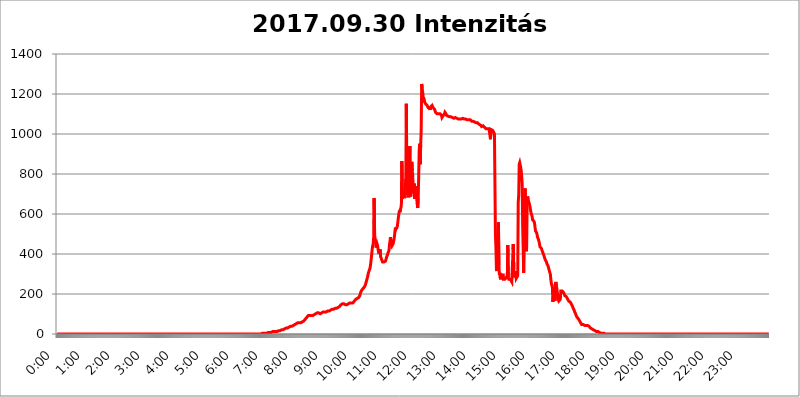
| Category | 2017.09.30 Intenzitás [W/m^2] |
|---|---|
| 0.0 | 0 |
| 0.0006944444444444445 | 0 |
| 0.001388888888888889 | 0 |
| 0.0020833333333333333 | 0 |
| 0.002777777777777778 | 0 |
| 0.003472222222222222 | 0 |
| 0.004166666666666667 | 0 |
| 0.004861111111111111 | 0 |
| 0.005555555555555556 | 0 |
| 0.0062499999999999995 | 0 |
| 0.006944444444444444 | 0 |
| 0.007638888888888889 | 0 |
| 0.008333333333333333 | 0 |
| 0.009027777777777779 | 0 |
| 0.009722222222222222 | 0 |
| 0.010416666666666666 | 0 |
| 0.011111111111111112 | 0 |
| 0.011805555555555555 | 0 |
| 0.012499999999999999 | 0 |
| 0.013194444444444444 | 0 |
| 0.013888888888888888 | 0 |
| 0.014583333333333332 | 0 |
| 0.015277777777777777 | 0 |
| 0.015972222222222224 | 0 |
| 0.016666666666666666 | 0 |
| 0.017361111111111112 | 0 |
| 0.018055555555555557 | 0 |
| 0.01875 | 0 |
| 0.019444444444444445 | 0 |
| 0.02013888888888889 | 0 |
| 0.020833333333333332 | 0 |
| 0.02152777777777778 | 0 |
| 0.022222222222222223 | 0 |
| 0.02291666666666667 | 0 |
| 0.02361111111111111 | 0 |
| 0.024305555555555556 | 0 |
| 0.024999999999999998 | 0 |
| 0.025694444444444447 | 0 |
| 0.02638888888888889 | 0 |
| 0.027083333333333334 | 0 |
| 0.027777777777777776 | 0 |
| 0.02847222222222222 | 0 |
| 0.029166666666666664 | 0 |
| 0.029861111111111113 | 0 |
| 0.030555555555555555 | 0 |
| 0.03125 | 0 |
| 0.03194444444444445 | 0 |
| 0.03263888888888889 | 0 |
| 0.03333333333333333 | 0 |
| 0.034027777777777775 | 0 |
| 0.034722222222222224 | 0 |
| 0.035416666666666666 | 0 |
| 0.036111111111111115 | 0 |
| 0.03680555555555556 | 0 |
| 0.0375 | 0 |
| 0.03819444444444444 | 0 |
| 0.03888888888888889 | 0 |
| 0.03958333333333333 | 0 |
| 0.04027777777777778 | 0 |
| 0.04097222222222222 | 0 |
| 0.041666666666666664 | 0 |
| 0.042361111111111106 | 0 |
| 0.04305555555555556 | 0 |
| 0.043750000000000004 | 0 |
| 0.044444444444444446 | 0 |
| 0.04513888888888889 | 0 |
| 0.04583333333333334 | 0 |
| 0.04652777777777778 | 0 |
| 0.04722222222222222 | 0 |
| 0.04791666666666666 | 0 |
| 0.04861111111111111 | 0 |
| 0.049305555555555554 | 0 |
| 0.049999999999999996 | 0 |
| 0.05069444444444445 | 0 |
| 0.051388888888888894 | 0 |
| 0.052083333333333336 | 0 |
| 0.05277777777777778 | 0 |
| 0.05347222222222222 | 0 |
| 0.05416666666666667 | 0 |
| 0.05486111111111111 | 0 |
| 0.05555555555555555 | 0 |
| 0.05625 | 0 |
| 0.05694444444444444 | 0 |
| 0.057638888888888885 | 0 |
| 0.05833333333333333 | 0 |
| 0.05902777777777778 | 0 |
| 0.059722222222222225 | 0 |
| 0.06041666666666667 | 0 |
| 0.061111111111111116 | 0 |
| 0.06180555555555556 | 0 |
| 0.0625 | 0 |
| 0.06319444444444444 | 0 |
| 0.06388888888888888 | 0 |
| 0.06458333333333334 | 0 |
| 0.06527777777777778 | 0 |
| 0.06597222222222222 | 0 |
| 0.06666666666666667 | 0 |
| 0.06736111111111111 | 0 |
| 0.06805555555555555 | 0 |
| 0.06874999999999999 | 0 |
| 0.06944444444444443 | 0 |
| 0.07013888888888889 | 0 |
| 0.07083333333333333 | 0 |
| 0.07152777777777779 | 0 |
| 0.07222222222222223 | 0 |
| 0.07291666666666667 | 0 |
| 0.07361111111111111 | 0 |
| 0.07430555555555556 | 0 |
| 0.075 | 0 |
| 0.07569444444444444 | 0 |
| 0.0763888888888889 | 0 |
| 0.07708333333333334 | 0 |
| 0.07777777777777778 | 0 |
| 0.07847222222222222 | 0 |
| 0.07916666666666666 | 0 |
| 0.0798611111111111 | 0 |
| 0.08055555555555556 | 0 |
| 0.08125 | 0 |
| 0.08194444444444444 | 0 |
| 0.08263888888888889 | 0 |
| 0.08333333333333333 | 0 |
| 0.08402777777777777 | 0 |
| 0.08472222222222221 | 0 |
| 0.08541666666666665 | 0 |
| 0.08611111111111112 | 0 |
| 0.08680555555555557 | 0 |
| 0.08750000000000001 | 0 |
| 0.08819444444444445 | 0 |
| 0.08888888888888889 | 0 |
| 0.08958333333333333 | 0 |
| 0.09027777777777778 | 0 |
| 0.09097222222222222 | 0 |
| 0.09166666666666667 | 0 |
| 0.09236111111111112 | 0 |
| 0.09305555555555556 | 0 |
| 0.09375 | 0 |
| 0.09444444444444444 | 0 |
| 0.09513888888888888 | 0 |
| 0.09583333333333333 | 0 |
| 0.09652777777777777 | 0 |
| 0.09722222222222222 | 0 |
| 0.09791666666666667 | 0 |
| 0.09861111111111111 | 0 |
| 0.09930555555555555 | 0 |
| 0.09999999999999999 | 0 |
| 0.10069444444444443 | 0 |
| 0.1013888888888889 | 0 |
| 0.10208333333333335 | 0 |
| 0.10277777777777779 | 0 |
| 0.10347222222222223 | 0 |
| 0.10416666666666667 | 0 |
| 0.10486111111111111 | 0 |
| 0.10555555555555556 | 0 |
| 0.10625 | 0 |
| 0.10694444444444444 | 0 |
| 0.1076388888888889 | 0 |
| 0.10833333333333334 | 0 |
| 0.10902777777777778 | 0 |
| 0.10972222222222222 | 0 |
| 0.1111111111111111 | 0 |
| 0.11180555555555556 | 0 |
| 0.11180555555555556 | 0 |
| 0.1125 | 0 |
| 0.11319444444444444 | 0 |
| 0.11388888888888889 | 0 |
| 0.11458333333333333 | 0 |
| 0.11527777777777777 | 0 |
| 0.11597222222222221 | 0 |
| 0.11666666666666665 | 0 |
| 0.1173611111111111 | 0 |
| 0.11805555555555557 | 0 |
| 0.11944444444444445 | 0 |
| 0.12013888888888889 | 0 |
| 0.12083333333333333 | 0 |
| 0.12152777777777778 | 0 |
| 0.12222222222222223 | 0 |
| 0.12291666666666667 | 0 |
| 0.12291666666666667 | 0 |
| 0.12361111111111112 | 0 |
| 0.12430555555555556 | 0 |
| 0.125 | 0 |
| 0.12569444444444444 | 0 |
| 0.12638888888888888 | 0 |
| 0.12708333333333333 | 0 |
| 0.16875 | 0 |
| 0.12847222222222224 | 0 |
| 0.12916666666666668 | 0 |
| 0.12986111111111112 | 0 |
| 0.13055555555555556 | 0 |
| 0.13125 | 0 |
| 0.13194444444444445 | 0 |
| 0.1326388888888889 | 0 |
| 0.13333333333333333 | 0 |
| 0.13402777777777777 | 0 |
| 0.13402777777777777 | 0 |
| 0.13472222222222222 | 0 |
| 0.13541666666666666 | 0 |
| 0.1361111111111111 | 0 |
| 0.13749999999999998 | 0 |
| 0.13819444444444443 | 0 |
| 0.1388888888888889 | 0 |
| 0.13958333333333334 | 0 |
| 0.14027777777777778 | 0 |
| 0.14097222222222222 | 0 |
| 0.14166666666666666 | 0 |
| 0.1423611111111111 | 0 |
| 0.14305555555555557 | 0 |
| 0.14375000000000002 | 0 |
| 0.14444444444444446 | 0 |
| 0.1451388888888889 | 0 |
| 0.1451388888888889 | 0 |
| 0.14652777777777778 | 0 |
| 0.14722222222222223 | 0 |
| 0.14791666666666667 | 0 |
| 0.1486111111111111 | 0 |
| 0.14930555555555555 | 0 |
| 0.15 | 0 |
| 0.15069444444444444 | 0 |
| 0.15138888888888888 | 0 |
| 0.15208333333333332 | 0 |
| 0.15277777777777776 | 0 |
| 0.15347222222222223 | 0 |
| 0.15416666666666667 | 0 |
| 0.15486111111111112 | 0 |
| 0.15555555555555556 | 0 |
| 0.15625 | 0 |
| 0.15694444444444444 | 0 |
| 0.15763888888888888 | 0 |
| 0.15833333333333333 | 0 |
| 0.15902777777777777 | 0 |
| 0.15972222222222224 | 0 |
| 0.16041666666666668 | 0 |
| 0.16111111111111112 | 0 |
| 0.16180555555555556 | 0 |
| 0.1625 | 0 |
| 0.16319444444444445 | 0 |
| 0.1638888888888889 | 0 |
| 0.16458333333333333 | 0 |
| 0.16527777777777777 | 0 |
| 0.16597222222222222 | 0 |
| 0.16666666666666666 | 0 |
| 0.1673611111111111 | 0 |
| 0.16805555555555554 | 0 |
| 0.16874999999999998 | 0 |
| 0.16944444444444443 | 0 |
| 0.17013888888888887 | 0 |
| 0.1708333333333333 | 0 |
| 0.17152777777777775 | 0 |
| 0.17222222222222225 | 0 |
| 0.1729166666666667 | 0 |
| 0.17361111111111113 | 0 |
| 0.17430555555555557 | 0 |
| 0.17500000000000002 | 0 |
| 0.17569444444444446 | 0 |
| 0.1763888888888889 | 0 |
| 0.17708333333333334 | 0 |
| 0.17777777777777778 | 0 |
| 0.17847222222222223 | 0 |
| 0.17916666666666667 | 0 |
| 0.1798611111111111 | 0 |
| 0.18055555555555555 | 0 |
| 0.18125 | 0 |
| 0.18194444444444444 | 0 |
| 0.1826388888888889 | 0 |
| 0.18333333333333335 | 0 |
| 0.1840277777777778 | 0 |
| 0.18472222222222223 | 0 |
| 0.18541666666666667 | 0 |
| 0.18611111111111112 | 0 |
| 0.18680555555555556 | 0 |
| 0.1875 | 0 |
| 0.18819444444444444 | 0 |
| 0.18888888888888888 | 0 |
| 0.18958333333333333 | 0 |
| 0.19027777777777777 | 0 |
| 0.1909722222222222 | 0 |
| 0.19166666666666665 | 0 |
| 0.19236111111111112 | 0 |
| 0.19305555555555554 | 0 |
| 0.19375 | 0 |
| 0.19444444444444445 | 0 |
| 0.1951388888888889 | 0 |
| 0.19583333333333333 | 0 |
| 0.19652777777777777 | 0 |
| 0.19722222222222222 | 0 |
| 0.19791666666666666 | 0 |
| 0.1986111111111111 | 0 |
| 0.19930555555555554 | 0 |
| 0.19999999999999998 | 0 |
| 0.20069444444444443 | 0 |
| 0.20138888888888887 | 0 |
| 0.2020833333333333 | 0 |
| 0.2027777777777778 | 0 |
| 0.2034722222222222 | 0 |
| 0.2041666666666667 | 0 |
| 0.20486111111111113 | 0 |
| 0.20555555555555557 | 0 |
| 0.20625000000000002 | 0 |
| 0.20694444444444446 | 0 |
| 0.2076388888888889 | 0 |
| 0.20833333333333334 | 0 |
| 0.20902777777777778 | 0 |
| 0.20972222222222223 | 0 |
| 0.21041666666666667 | 0 |
| 0.2111111111111111 | 0 |
| 0.21180555555555555 | 0 |
| 0.2125 | 0 |
| 0.21319444444444444 | 0 |
| 0.2138888888888889 | 0 |
| 0.21458333333333335 | 0 |
| 0.2152777777777778 | 0 |
| 0.21597222222222223 | 0 |
| 0.21666666666666667 | 0 |
| 0.21736111111111112 | 0 |
| 0.21805555555555556 | 0 |
| 0.21875 | 0 |
| 0.21944444444444444 | 0 |
| 0.22013888888888888 | 0 |
| 0.22083333333333333 | 0 |
| 0.22152777777777777 | 0 |
| 0.2222222222222222 | 0 |
| 0.22291666666666665 | 0 |
| 0.2236111111111111 | 0 |
| 0.22430555555555556 | 0 |
| 0.225 | 0 |
| 0.22569444444444445 | 0 |
| 0.2263888888888889 | 0 |
| 0.22708333333333333 | 0 |
| 0.22777777777777777 | 0 |
| 0.22847222222222222 | 0 |
| 0.22916666666666666 | 0 |
| 0.2298611111111111 | 0 |
| 0.23055555555555554 | 0 |
| 0.23124999999999998 | 0 |
| 0.23194444444444443 | 0 |
| 0.23263888888888887 | 0 |
| 0.2333333333333333 | 0 |
| 0.2340277777777778 | 0 |
| 0.2347222222222222 | 0 |
| 0.2354166666666667 | 0 |
| 0.23611111111111113 | 0 |
| 0.23680555555555557 | 0 |
| 0.23750000000000002 | 0 |
| 0.23819444444444446 | 0 |
| 0.2388888888888889 | 0 |
| 0.23958333333333334 | 0 |
| 0.24027777777777778 | 0 |
| 0.24097222222222223 | 0 |
| 0.24166666666666667 | 0 |
| 0.2423611111111111 | 0 |
| 0.24305555555555555 | 0 |
| 0.24375 | 0 |
| 0.24444444444444446 | 0 |
| 0.24513888888888888 | 0 |
| 0.24583333333333335 | 0 |
| 0.2465277777777778 | 0 |
| 0.24722222222222223 | 0 |
| 0.24791666666666667 | 0 |
| 0.24861111111111112 | 0 |
| 0.24930555555555556 | 0 |
| 0.25 | 0 |
| 0.25069444444444444 | 0 |
| 0.2513888888888889 | 0 |
| 0.2520833333333333 | 0 |
| 0.25277777777777777 | 0 |
| 0.2534722222222222 | 0 |
| 0.25416666666666665 | 0 |
| 0.2548611111111111 | 0 |
| 0.2555555555555556 | 0 |
| 0.25625000000000003 | 0 |
| 0.2569444444444445 | 0 |
| 0.2576388888888889 | 0 |
| 0.25833333333333336 | 0 |
| 0.2590277777777778 | 0 |
| 0.25972222222222224 | 0 |
| 0.2604166666666667 | 0 |
| 0.2611111111111111 | 0 |
| 0.26180555555555557 | 0 |
| 0.2625 | 0 |
| 0.26319444444444445 | 0 |
| 0.2638888888888889 | 0 |
| 0.26458333333333334 | 0 |
| 0.2652777777777778 | 0 |
| 0.2659722222222222 | 0 |
| 0.26666666666666666 | 0 |
| 0.2673611111111111 | 0 |
| 0.26805555555555555 | 0 |
| 0.26875 | 0 |
| 0.26944444444444443 | 0 |
| 0.2701388888888889 | 0 |
| 0.2708333333333333 | 0 |
| 0.27152777777777776 | 0 |
| 0.2722222222222222 | 0 |
| 0.27291666666666664 | 0 |
| 0.2736111111111111 | 0 |
| 0.2743055555555555 | 0 |
| 0.27499999999999997 | 0 |
| 0.27569444444444446 | 0 |
| 0.27638888888888885 | 0 |
| 0.27708333333333335 | 0 |
| 0.2777777777777778 | 0 |
| 0.27847222222222223 | 0 |
| 0.2791666666666667 | 0 |
| 0.2798611111111111 | 0 |
| 0.28055555555555556 | 0 |
| 0.28125 | 0 |
| 0.28194444444444444 | 0 |
| 0.2826388888888889 | 0 |
| 0.2833333333333333 | 0 |
| 0.28402777777777777 | 0 |
| 0.2847222222222222 | 0 |
| 0.28541666666666665 | 0 |
| 0.28611111111111115 | 0 |
| 0.28680555555555554 | 0 |
| 0.28750000000000003 | 3.525 |
| 0.2881944444444445 | 3.525 |
| 0.2888888888888889 | 3.525 |
| 0.28958333333333336 | 3.525 |
| 0.2902777777777778 | 3.525 |
| 0.29097222222222224 | 3.525 |
| 0.2916666666666667 | 3.525 |
| 0.2923611111111111 | 3.525 |
| 0.29305555555555557 | 3.525 |
| 0.29375 | 3.525 |
| 0.29444444444444445 | 3.525 |
| 0.2951388888888889 | 3.525 |
| 0.29583333333333334 | 7.887 |
| 0.2965277777777778 | 7.887 |
| 0.2972222222222222 | 7.887 |
| 0.29791666666666666 | 7.887 |
| 0.2986111111111111 | 7.887 |
| 0.29930555555555555 | 7.887 |
| 0.3 | 7.887 |
| 0.30069444444444443 | 7.887 |
| 0.3013888888888889 | 12.257 |
| 0.3020833333333333 | 12.257 |
| 0.30277777777777776 | 12.257 |
| 0.3034722222222222 | 12.257 |
| 0.30416666666666664 | 12.257 |
| 0.3048611111111111 | 12.257 |
| 0.3055555555555555 | 12.257 |
| 0.30624999999999997 | 12.257 |
| 0.3069444444444444 | 12.257 |
| 0.3076388888888889 | 12.257 |
| 0.30833333333333335 | 12.257 |
| 0.3090277777777778 | 16.636 |
| 0.30972222222222223 | 16.636 |
| 0.3104166666666667 | 16.636 |
| 0.3111111111111111 | 16.636 |
| 0.31180555555555556 | 16.636 |
| 0.3125 | 16.636 |
| 0.31319444444444444 | 21.024 |
| 0.3138888888888889 | 21.024 |
| 0.3145833333333333 | 21.024 |
| 0.31527777777777777 | 21.024 |
| 0.3159722222222222 | 21.024 |
| 0.31666666666666665 | 21.024 |
| 0.31736111111111115 | 25.419 |
| 0.31805555555555554 | 25.419 |
| 0.31875000000000003 | 25.419 |
| 0.3194444444444445 | 25.419 |
| 0.3201388888888889 | 29.823 |
| 0.32083333333333336 | 29.823 |
| 0.3215277777777778 | 29.823 |
| 0.32222222222222224 | 29.823 |
| 0.3229166666666667 | 29.823 |
| 0.3236111111111111 | 34.234 |
| 0.32430555555555557 | 34.234 |
| 0.325 | 34.234 |
| 0.32569444444444445 | 34.234 |
| 0.3263888888888889 | 38.653 |
| 0.32708333333333334 | 38.653 |
| 0.3277777777777778 | 38.653 |
| 0.3284722222222222 | 38.653 |
| 0.32916666666666666 | 38.653 |
| 0.3298611111111111 | 38.653 |
| 0.33055555555555555 | 43.079 |
| 0.33125 | 43.079 |
| 0.33194444444444443 | 43.079 |
| 0.3326388888888889 | 47.511 |
| 0.3333333333333333 | 47.511 |
| 0.3340277777777778 | 51.951 |
| 0.3347222222222222 | 51.951 |
| 0.3354166666666667 | 51.951 |
| 0.3361111111111111 | 56.398 |
| 0.3368055555555556 | 56.398 |
| 0.33749999999999997 | 56.398 |
| 0.33819444444444446 | 56.398 |
| 0.33888888888888885 | 56.398 |
| 0.33958333333333335 | 56.398 |
| 0.34027777777777773 | 56.398 |
| 0.34097222222222223 | 56.398 |
| 0.3416666666666666 | 56.398 |
| 0.3423611111111111 | 60.85 |
| 0.3430555555555555 | 60.85 |
| 0.34375 | 60.85 |
| 0.3444444444444445 | 60.85 |
| 0.3451388888888889 | 65.31 |
| 0.3458333333333334 | 65.31 |
| 0.34652777777777777 | 65.31 |
| 0.34722222222222227 | 69.775 |
| 0.34791666666666665 | 74.246 |
| 0.34861111111111115 | 74.246 |
| 0.34930555555555554 | 78.722 |
| 0.35000000000000003 | 83.205 |
| 0.3506944444444444 | 83.205 |
| 0.3513888888888889 | 87.692 |
| 0.3520833333333333 | 92.184 |
| 0.3527777777777778 | 92.184 |
| 0.3534722222222222 | 92.184 |
| 0.3541666666666667 | 92.184 |
| 0.3548611111111111 | 92.184 |
| 0.35555555555555557 | 92.184 |
| 0.35625 | 92.184 |
| 0.35694444444444445 | 92.184 |
| 0.3576388888888889 | 92.184 |
| 0.35833333333333334 | 92.184 |
| 0.3590277777777778 | 92.184 |
| 0.3597222222222222 | 96.682 |
| 0.36041666666666666 | 96.682 |
| 0.3611111111111111 | 96.682 |
| 0.36180555555555555 | 101.184 |
| 0.3625 | 101.184 |
| 0.36319444444444443 | 101.184 |
| 0.3638888888888889 | 105.69 |
| 0.3645833333333333 | 105.69 |
| 0.3652777777777778 | 105.69 |
| 0.3659722222222222 | 105.69 |
| 0.3666666666666667 | 105.69 |
| 0.3673611111111111 | 105.69 |
| 0.3680555555555556 | 101.184 |
| 0.36874999999999997 | 101.184 |
| 0.36944444444444446 | 105.69 |
| 0.37013888888888885 | 105.69 |
| 0.37083333333333335 | 105.69 |
| 0.37152777777777773 | 105.69 |
| 0.37222222222222223 | 105.69 |
| 0.3729166666666666 | 110.201 |
| 0.3736111111111111 | 110.201 |
| 0.3743055555555555 | 110.201 |
| 0.375 | 110.201 |
| 0.3756944444444445 | 110.201 |
| 0.3763888888888889 | 110.201 |
| 0.3770833333333334 | 110.201 |
| 0.37777777777777777 | 110.201 |
| 0.37847222222222227 | 114.716 |
| 0.37916666666666665 | 114.716 |
| 0.37986111111111115 | 114.716 |
| 0.38055555555555554 | 114.716 |
| 0.38125000000000003 | 114.716 |
| 0.3819444444444444 | 119.235 |
| 0.3826388888888889 | 119.235 |
| 0.3833333333333333 | 119.235 |
| 0.3840277777777778 | 119.235 |
| 0.3847222222222222 | 119.235 |
| 0.3854166666666667 | 123.758 |
| 0.3861111111111111 | 123.758 |
| 0.38680555555555557 | 123.758 |
| 0.3875 | 123.758 |
| 0.38819444444444445 | 128.284 |
| 0.3888888888888889 | 128.284 |
| 0.38958333333333334 | 128.284 |
| 0.3902777777777778 | 128.284 |
| 0.3909722222222222 | 128.284 |
| 0.39166666666666666 | 128.284 |
| 0.3923611111111111 | 128.284 |
| 0.39305555555555555 | 132.814 |
| 0.39375 | 132.814 |
| 0.39444444444444443 | 132.814 |
| 0.3951388888888889 | 137.347 |
| 0.3958333333333333 | 137.347 |
| 0.3965277777777778 | 137.347 |
| 0.3972222222222222 | 141.884 |
| 0.3979166666666667 | 146.423 |
| 0.3986111111111111 | 146.423 |
| 0.3993055555555556 | 150.964 |
| 0.39999999999999997 | 150.964 |
| 0.40069444444444446 | 150.964 |
| 0.40138888888888885 | 150.964 |
| 0.40208333333333335 | 150.964 |
| 0.40277777777777773 | 150.964 |
| 0.40347222222222223 | 146.423 |
| 0.4041666666666666 | 146.423 |
| 0.4048611111111111 | 146.423 |
| 0.4055555555555555 | 146.423 |
| 0.40625 | 146.423 |
| 0.4069444444444445 | 146.423 |
| 0.4076388888888889 | 146.423 |
| 0.4083333333333334 | 150.964 |
| 0.40902777777777777 | 155.509 |
| 0.40972222222222227 | 155.509 |
| 0.41041666666666665 | 155.509 |
| 0.41111111111111115 | 155.509 |
| 0.41180555555555554 | 155.509 |
| 0.41250000000000003 | 155.509 |
| 0.4131944444444444 | 155.509 |
| 0.4138888888888889 | 155.509 |
| 0.4145833333333333 | 155.509 |
| 0.4152777777777778 | 160.056 |
| 0.4159722222222222 | 160.056 |
| 0.4166666666666667 | 164.605 |
| 0.4173611111111111 | 169.156 |
| 0.41805555555555557 | 169.156 |
| 0.41875 | 173.709 |
| 0.41944444444444445 | 173.709 |
| 0.4201388888888889 | 173.709 |
| 0.42083333333333334 | 178.264 |
| 0.4215277777777778 | 178.264 |
| 0.4222222222222222 | 182.82 |
| 0.42291666666666666 | 182.82 |
| 0.4236111111111111 | 187.378 |
| 0.42430555555555555 | 191.937 |
| 0.425 | 201.058 |
| 0.42569444444444443 | 210.182 |
| 0.4263888888888889 | 214.746 |
| 0.4270833333333333 | 219.309 |
| 0.4277777777777778 | 219.309 |
| 0.4284722222222222 | 223.873 |
| 0.4291666666666667 | 228.436 |
| 0.4298611111111111 | 233 |
| 0.4305555555555556 | 233 |
| 0.43124999999999997 | 237.564 |
| 0.43194444444444446 | 242.127 |
| 0.43263888888888885 | 251.251 |
| 0.43333333333333335 | 255.813 |
| 0.43402777777777773 | 269.49 |
| 0.43472222222222223 | 278.603 |
| 0.4354166666666666 | 287.709 |
| 0.4361111111111111 | 301.354 |
| 0.4368055555555555 | 310.44 |
| 0.4375 | 314.98 |
| 0.4381944444444445 | 324.052 |
| 0.4388888888888889 | 333.113 |
| 0.4395833333333334 | 351.198 |
| 0.44027777777777777 | 373.729 |
| 0.44097222222222227 | 396.164 |
| 0.44166666666666665 | 422.943 |
| 0.44236111111111115 | 440.702 |
| 0.44305555555555554 | 449.551 |
| 0.44375000000000003 | 480.356 |
| 0.4444444444444444 | 679.395 |
| 0.4451388888888889 | 493.475 |
| 0.4458333333333333 | 497.836 |
| 0.4465277777777778 | 462.786 |
| 0.4472222222222222 | 431.833 |
| 0.4479166666666667 | 431.833 |
| 0.4486111111111111 | 449.551 |
| 0.44930555555555557 | 440.702 |
| 0.45 | 422.943 |
| 0.45069444444444445 | 409.574 |
| 0.4513888888888889 | 400.638 |
| 0.45208333333333334 | 405.108 |
| 0.4527777777777778 | 422.943 |
| 0.4534722222222222 | 387.202 |
| 0.45416666666666666 | 382.715 |
| 0.4548611111111111 | 373.729 |
| 0.45555555555555555 | 369.23 |
| 0.45625 | 360.221 |
| 0.45694444444444443 | 360.221 |
| 0.4576388888888889 | 360.221 |
| 0.4583333333333333 | 360.221 |
| 0.4590277777777778 | 360.221 |
| 0.4597222222222222 | 360.221 |
| 0.4604166666666667 | 364.728 |
| 0.4611111111111111 | 369.23 |
| 0.4618055555555556 | 382.715 |
| 0.46249999999999997 | 387.202 |
| 0.46319444444444446 | 396.164 |
| 0.46388888888888885 | 405.108 |
| 0.46458333333333335 | 409.574 |
| 0.46527777777777773 | 418.492 |
| 0.46597222222222223 | 445.129 |
| 0.4666666666666666 | 462.786 |
| 0.4673611111111111 | 484.735 |
| 0.4680555555555555 | 458.38 |
| 0.46875 | 449.551 |
| 0.4694444444444445 | 440.702 |
| 0.4701388888888889 | 440.702 |
| 0.4708333333333334 | 449.551 |
| 0.47152777777777777 | 458.38 |
| 0.47222222222222227 | 471.582 |
| 0.47291666666666665 | 489.108 |
| 0.47361111111111115 | 510.885 |
| 0.47430555555555554 | 532.513 |
| 0.47500000000000003 | 523.88 |
| 0.4756944444444444 | 523.88 |
| 0.4763888888888889 | 532.513 |
| 0.4770833333333333 | 541.121 |
| 0.4777777777777778 | 545.416 |
| 0.4784722222222222 | 583.779 |
| 0.4791666666666667 | 600.661 |
| 0.4798611111111111 | 617.436 |
| 0.48055555555555557 | 609.062 |
| 0.48125 | 621.613 |
| 0.48194444444444445 | 629.948 |
| 0.4826388888888889 | 646.537 |
| 0.48333333333333334 | 864.493 |
| 0.4840277777777778 | 675.311 |
| 0.4847222222222222 | 691.608 |
| 0.48541666666666666 | 715.858 |
| 0.4861111111111111 | 699.717 |
| 0.48680555555555555 | 707.8 |
| 0.4875 | 679.395 |
| 0.48819444444444443 | 679.395 |
| 0.4888888888888889 | 775.492 |
| 0.4895833333333333 | 1150.946 |
| 0.4902777777777778 | 771.559 |
| 0.4909722222222222 | 798.974 |
| 0.4916666666666667 | 695.666 |
| 0.4923611111111111 | 703.762 |
| 0.4930555555555556 | 683.473 |
| 0.49374999999999997 | 679.395 |
| 0.49444444444444446 | 940.082 |
| 0.49513888888888885 | 703.762 |
| 0.49583333333333335 | 687.544 |
| 0.49652777777777773 | 687.544 |
| 0.49722222222222223 | 860.676 |
| 0.4979166666666666 | 814.519 |
| 0.4986111111111111 | 791.169 |
| 0.4993055555555555 | 715.858 |
| 0.5 | 703.762 |
| 0.5006944444444444 | 751.803 |
| 0.5013888888888889 | 675.311 |
| 0.5020833333333333 | 715.858 |
| 0.5027777777777778 | 691.608 |
| 0.5034722222222222 | 687.544 |
| 0.5041666666666667 | 739.877 |
| 0.5048611111111111 | 650.667 |
| 0.5055555555555555 | 629.948 |
| 0.50625 | 679.395 |
| 0.5069444444444444 | 791.169 |
| 0.5076388888888889 | 917.534 |
| 0.5083333333333333 | 951.327 |
| 0.5090277777777777 | 849.199 |
| 0.5097222222222222 | 943.832 |
| 0.5104166666666666 | 1014.852 |
| 0.5111111111111112 | 1250.275 |
| 0.5118055555555555 | 1229.899 |
| 0.5125000000000001 | 1209.807 |
| 0.5131944444444444 | 1186.03 |
| 0.513888888888889 | 1186.03 |
| 0.5145833333333333 | 1174.263 |
| 0.5152777777777778 | 1158.689 |
| 0.5159722222222222 | 1154.814 |
| 0.5166666666666667 | 1150.946 |
| 0.517361111111111 | 1150.946 |
| 0.5180555555555556 | 1147.086 |
| 0.5187499999999999 | 1143.232 |
| 0.5194444444444445 | 1139.384 |
| 0.5201388888888888 | 1131.708 |
| 0.5208333333333334 | 1131.708 |
| 0.5215277777777778 | 1127.879 |
| 0.5222222222222223 | 1127.879 |
| 0.5229166666666667 | 1120.238 |
| 0.5236111111111111 | 1135.543 |
| 0.5243055555555556 | 1135.543 |
| 0.525 | 1139.384 |
| 0.5256944444444445 | 1143.232 |
| 0.5263888888888889 | 1139.384 |
| 0.5270833333333333 | 1131.708 |
| 0.5277777777777778 | 1127.879 |
| 0.5284722222222222 | 1131.708 |
| 0.5291666666666667 | 1124.056 |
| 0.5298611111111111 | 1116.426 |
| 0.5305555555555556 | 1108.816 |
| 0.53125 | 1108.816 |
| 0.5319444444444444 | 1108.816 |
| 0.5326388888888889 | 1101.226 |
| 0.5333333333333333 | 1097.437 |
| 0.5340277777777778 | 1097.437 |
| 0.5347222222222222 | 1101.226 |
| 0.5354166666666667 | 1101.226 |
| 0.5361111111111111 | 1101.226 |
| 0.5368055555555555 | 1101.226 |
| 0.5375 | 1101.226 |
| 0.5381944444444444 | 1101.226 |
| 0.5388888888888889 | 1093.653 |
| 0.5395833333333333 | 1082.324 |
| 0.5402777777777777 | 1086.097 |
| 0.5409722222222222 | 1089.873 |
| 0.5416666666666666 | 1086.097 |
| 0.5423611111111112 | 1093.653 |
| 0.5430555555555555 | 1101.226 |
| 0.5437500000000001 | 1108.816 |
| 0.5444444444444444 | 1105.019 |
| 0.545138888888889 | 1101.226 |
| 0.5458333333333333 | 1093.653 |
| 0.5465277777777778 | 1089.873 |
| 0.5472222222222222 | 1089.873 |
| 0.5479166666666667 | 1089.873 |
| 0.548611111111111 | 1093.653 |
| 0.5493055555555556 | 1086.097 |
| 0.5499999999999999 | 1086.097 |
| 0.5506944444444445 | 1082.324 |
| 0.5513888888888888 | 1082.324 |
| 0.5520833333333334 | 1086.097 |
| 0.5527777777777778 | 1086.097 |
| 0.5534722222222223 | 1086.097 |
| 0.5541666666666667 | 1082.324 |
| 0.5548611111111111 | 1078.555 |
| 0.5555555555555556 | 1078.555 |
| 0.55625 | 1078.555 |
| 0.5569444444444445 | 1082.324 |
| 0.5576388888888889 | 1082.324 |
| 0.5583333333333333 | 1082.324 |
| 0.5590277777777778 | 1082.324 |
| 0.5597222222222222 | 1082.324 |
| 0.5604166666666667 | 1078.555 |
| 0.5611111111111111 | 1082.324 |
| 0.5618055555555556 | 1078.555 |
| 0.5625 | 1074.789 |
| 0.5631944444444444 | 1074.789 |
| 0.5638888888888889 | 1074.789 |
| 0.5645833333333333 | 1074.789 |
| 0.5652777777777778 | 1078.555 |
| 0.5659722222222222 | 1074.789 |
| 0.5666666666666667 | 1074.789 |
| 0.5673611111111111 | 1078.555 |
| 0.5680555555555555 | 1078.555 |
| 0.56875 | 1078.555 |
| 0.5694444444444444 | 1078.555 |
| 0.5701388888888889 | 1078.555 |
| 0.5708333333333333 | 1074.789 |
| 0.5715277777777777 | 1074.789 |
| 0.5722222222222222 | 1074.789 |
| 0.5729166666666666 | 1074.789 |
| 0.5736111111111112 | 1074.789 |
| 0.5743055555555555 | 1074.789 |
| 0.5750000000000001 | 1071.027 |
| 0.5756944444444444 | 1071.027 |
| 0.576388888888889 | 1074.789 |
| 0.5770833333333333 | 1071.027 |
| 0.5777777777777778 | 1071.027 |
| 0.5784722222222222 | 1071.027 |
| 0.5791666666666667 | 1071.027 |
| 0.579861111111111 | 1071.027 |
| 0.5805555555555556 | 1067.267 |
| 0.5812499999999999 | 1063.51 |
| 0.5819444444444445 | 1059.756 |
| 0.5826388888888888 | 1063.51 |
| 0.5833333333333334 | 1063.51 |
| 0.5840277777777778 | 1063.51 |
| 0.5847222222222223 | 1063.51 |
| 0.5854166666666667 | 1059.756 |
| 0.5861111111111111 | 1059.756 |
| 0.5868055555555556 | 1059.756 |
| 0.5875 | 1056.004 |
| 0.5881944444444445 | 1056.004 |
| 0.5888888888888889 | 1056.004 |
| 0.5895833333333333 | 1056.004 |
| 0.5902777777777778 | 1052.255 |
| 0.5909722222222222 | 1052.255 |
| 0.5916666666666667 | 1048.508 |
| 0.5923611111111111 | 1048.508 |
| 0.5930555555555556 | 1044.762 |
| 0.59375 | 1044.762 |
| 0.5944444444444444 | 1044.762 |
| 0.5951388888888889 | 1037.277 |
| 0.5958333333333333 | 1041.019 |
| 0.5965277777777778 | 1037.277 |
| 0.5972222222222222 | 1041.019 |
| 0.5979166666666667 | 1037.277 |
| 0.5986111111111111 | 1037.277 |
| 0.5993055555555555 | 1033.537 |
| 0.6 | 1029.798 |
| 0.6006944444444444 | 1029.798 |
| 0.6013888888888889 | 1026.06 |
| 0.6020833333333333 | 1026.06 |
| 0.6027777777777777 | 1022.323 |
| 0.6034722222222222 | 1026.06 |
| 0.6041666666666666 | 1029.798 |
| 0.6048611111111112 | 1029.798 |
| 0.6055555555555555 | 1026.06 |
| 0.6062500000000001 | 1029.798 |
| 0.6069444444444444 | 1029.798 |
| 0.607638888888889 | 973.772 |
| 0.6083333333333333 | 1022.323 |
| 0.6090277777777778 | 1022.323 |
| 0.6097222222222222 | 1018.587 |
| 0.6104166666666667 | 1018.587 |
| 0.611111111111111 | 1014.852 |
| 0.6118055555555556 | 1011.118 |
| 0.6124999999999999 | 1007.383 |
| 0.6131944444444445 | 999.916 |
| 0.6138888888888888 | 996.182 |
| 0.6145833333333334 | 493.475 |
| 0.6152777777777778 | 431.833 |
| 0.6159722222222223 | 324.052 |
| 0.6166666666666667 | 314.98 |
| 0.6173611111111111 | 342.162 |
| 0.6180555555555556 | 497.836 |
| 0.61875 | 558.261 |
| 0.6194444444444445 | 342.162 |
| 0.6201388888888889 | 296.808 |
| 0.6208333333333333 | 305.898 |
| 0.6215277777777778 | 278.603 |
| 0.6222222222222222 | 278.603 |
| 0.6229166666666667 | 278.603 |
| 0.6236111111111111 | 278.603 |
| 0.6243055555555556 | 292.259 |
| 0.625 | 301.354 |
| 0.6256944444444444 | 274.047 |
| 0.6263888888888889 | 269.49 |
| 0.6270833333333333 | 274.047 |
| 0.6277777777777778 | 274.047 |
| 0.6284722222222222 | 278.603 |
| 0.6291666666666667 | 278.603 |
| 0.6298611111111111 | 283.156 |
| 0.6305555555555555 | 283.156 |
| 0.63125 | 292.259 |
| 0.6319444444444444 | 445.129 |
| 0.6326388888888889 | 283.156 |
| 0.6333333333333333 | 274.047 |
| 0.6340277777777777 | 269.49 |
| 0.6347222222222222 | 269.49 |
| 0.6354166666666666 | 274.047 |
| 0.6361111111111112 | 269.49 |
| 0.6368055555555555 | 269.49 |
| 0.6375000000000001 | 260.373 |
| 0.6381944444444444 | 260.373 |
| 0.638888888888889 | 260.373 |
| 0.6395833333333333 | 449.551 |
| 0.6402777777777778 | 324.052 |
| 0.6409722222222222 | 283.156 |
| 0.6416666666666667 | 283.156 |
| 0.642361111111111 | 283.156 |
| 0.6430555555555556 | 314.98 |
| 0.6437499999999999 | 278.603 |
| 0.6444444444444445 | 278.603 |
| 0.6451388888888888 | 278.603 |
| 0.6458333333333334 | 292.259 |
| 0.6465277777777778 | 658.909 |
| 0.6472222222222223 | 695.666 |
| 0.6479166666666667 | 849.199 |
| 0.6486111111111111 | 856.855 |
| 0.6493055555555556 | 845.365 |
| 0.65 | 833.834 |
| 0.6506944444444445 | 818.392 |
| 0.6513888888888889 | 787.258 |
| 0.6520833333333333 | 751.803 |
| 0.6527777777777778 | 536.82 |
| 0.6534722222222222 | 431.833 |
| 0.6541666666666667 | 305.898 |
| 0.6548611111111111 | 510.885 |
| 0.6555555555555556 | 715.858 |
| 0.65625 | 727.896 |
| 0.6569444444444444 | 625.784 |
| 0.6576388888888889 | 414.035 |
| 0.6583333333333333 | 427.39 |
| 0.6590277777777778 | 642.4 |
| 0.6597222222222222 | 687.544 |
| 0.6604166666666667 | 671.22 |
| 0.6611111111111111 | 663.019 |
| 0.6618055555555555 | 658.909 |
| 0.6625 | 646.537 |
| 0.6631944444444444 | 634.105 |
| 0.6638888888888889 | 617.436 |
| 0.6645833333333333 | 604.864 |
| 0.6652777777777777 | 596.45 |
| 0.6659722222222222 | 588.009 |
| 0.6666666666666666 | 571.049 |
| 0.6673611111111111 | 566.793 |
| 0.6680555555555556 | 571.049 |
| 0.6687500000000001 | 562.53 |
| 0.6694444444444444 | 553.986 |
| 0.6701388888888888 | 532.513 |
| 0.6708333333333334 | 515.223 |
| 0.6715277777777778 | 515.223 |
| 0.6722222222222222 | 506.542 |
| 0.6729166666666666 | 497.836 |
| 0.6736111111111112 | 484.735 |
| 0.6743055555555556 | 480.356 |
| 0.6749999999999999 | 471.582 |
| 0.6756944444444444 | 462.786 |
| 0.6763888888888889 | 449.551 |
| 0.6770833333333334 | 436.27 |
| 0.6777777777777777 | 431.833 |
| 0.6784722222222223 | 431.833 |
| 0.6791666666666667 | 427.39 |
| 0.6798611111111111 | 418.492 |
| 0.6805555555555555 | 414.035 |
| 0.68125 | 405.108 |
| 0.6819444444444445 | 400.638 |
| 0.6826388888888889 | 391.685 |
| 0.6833333333333332 | 382.715 |
| 0.6840277777777778 | 378.224 |
| 0.6847222222222222 | 369.23 |
| 0.6854166666666667 | 364.728 |
| 0.686111111111111 | 360.221 |
| 0.6868055555555556 | 351.198 |
| 0.6875 | 351.198 |
| 0.6881944444444444 | 342.162 |
| 0.688888888888889 | 337.639 |
| 0.6895833333333333 | 324.052 |
| 0.6902777777777778 | 314.98 |
| 0.6909722222222222 | 310.44 |
| 0.6916666666666668 | 296.808 |
| 0.6923611111111111 | 269.49 |
| 0.6930555555555555 | 251.251 |
| 0.69375 | 255.813 |
| 0.6944444444444445 | 233 |
| 0.6951388888888889 | 160.056 |
| 0.6958333333333333 | 187.378 |
| 0.6965277777777777 | 201.058 |
| 0.6972222222222223 | 223.873 |
| 0.6979166666666666 | 164.605 |
| 0.6986111111111111 | 251.251 |
| 0.6993055555555556 | 260.373 |
| 0.7000000000000001 | 260.373 |
| 0.7006944444444444 | 223.873 |
| 0.7013888888888888 | 210.182 |
| 0.7020833333333334 | 178.264 |
| 0.7027777777777778 | 173.709 |
| 0.7034722222222222 | 164.605 |
| 0.7041666666666666 | 160.056 |
| 0.7048611111111112 | 160.056 |
| 0.7055555555555556 | 173.709 |
| 0.7062499999999999 | 214.746 |
| 0.7069444444444444 | 219.309 |
| 0.7076388888888889 | 214.746 |
| 0.7083333333333334 | 214.746 |
| 0.7090277777777777 | 210.182 |
| 0.7097222222222223 | 210.182 |
| 0.7104166666666667 | 205.62 |
| 0.7111111111111111 | 201.058 |
| 0.7118055555555555 | 191.937 |
| 0.7125 | 191.937 |
| 0.7131944444444445 | 187.378 |
| 0.7138888888888889 | 187.378 |
| 0.7145833333333332 | 182.82 |
| 0.7152777777777778 | 178.264 |
| 0.7159722222222222 | 173.709 |
| 0.7166666666666667 | 173.709 |
| 0.717361111111111 | 164.605 |
| 0.7180555555555556 | 164.605 |
| 0.71875 | 164.605 |
| 0.7194444444444444 | 160.056 |
| 0.720138888888889 | 155.509 |
| 0.7208333333333333 | 150.964 |
| 0.7215277777777778 | 146.423 |
| 0.7222222222222222 | 141.884 |
| 0.7229166666666668 | 137.347 |
| 0.7236111111111111 | 128.284 |
| 0.7243055555555555 | 123.758 |
| 0.725 | 119.235 |
| 0.7256944444444445 | 110.201 |
| 0.7263888888888889 | 105.69 |
| 0.7270833333333333 | 101.184 |
| 0.7277777777777777 | 92.184 |
| 0.7284722222222223 | 87.692 |
| 0.7291666666666666 | 83.205 |
| 0.7298611111111111 | 83.205 |
| 0.7305555555555556 | 78.722 |
| 0.7312500000000001 | 74.246 |
| 0.7319444444444444 | 69.775 |
| 0.7326388888888888 | 65.31 |
| 0.7333333333333334 | 60.85 |
| 0.7340277777777778 | 56.398 |
| 0.7347222222222222 | 51.951 |
| 0.7354166666666666 | 47.511 |
| 0.7361111111111112 | 47.511 |
| 0.7368055555555556 | 47.511 |
| 0.7374999999999999 | 47.511 |
| 0.7381944444444444 | 43.079 |
| 0.7388888888888889 | 47.511 |
| 0.7395833333333334 | 43.079 |
| 0.7402777777777777 | 47.511 |
| 0.7409722222222223 | 43.079 |
| 0.7416666666666667 | 43.079 |
| 0.7423611111111111 | 43.079 |
| 0.7430555555555555 | 43.079 |
| 0.74375 | 43.079 |
| 0.7444444444444445 | 43.079 |
| 0.7451388888888889 | 38.653 |
| 0.7458333333333332 | 38.653 |
| 0.7465277777777778 | 34.234 |
| 0.7472222222222222 | 34.234 |
| 0.7479166666666667 | 29.823 |
| 0.748611111111111 | 29.823 |
| 0.7493055555555556 | 25.419 |
| 0.75 | 25.419 |
| 0.7506944444444444 | 25.419 |
| 0.751388888888889 | 21.024 |
| 0.7520833333333333 | 21.024 |
| 0.7527777777777778 | 21.024 |
| 0.7534722222222222 | 21.024 |
| 0.7541666666666668 | 16.636 |
| 0.7548611111111111 | 16.636 |
| 0.7555555555555555 | 16.636 |
| 0.75625 | 12.257 |
| 0.7569444444444445 | 12.257 |
| 0.7576388888888889 | 12.257 |
| 0.7583333333333333 | 12.257 |
| 0.7590277777777777 | 7.887 |
| 0.7597222222222223 | 7.887 |
| 0.7604166666666666 | 7.887 |
| 0.7611111111111111 | 7.887 |
| 0.7618055555555556 | 3.525 |
| 0.7625000000000001 | 3.525 |
| 0.7631944444444444 | 3.525 |
| 0.7638888888888888 | 3.525 |
| 0.7645833333333334 | 3.525 |
| 0.7652777777777778 | 3.525 |
| 0.7659722222222222 | 3.525 |
| 0.7666666666666666 | 3.525 |
| 0.7673611111111112 | 0 |
| 0.7680555555555556 | 0 |
| 0.7687499999999999 | 0 |
| 0.7694444444444444 | 0 |
| 0.7701388888888889 | 0 |
| 0.7708333333333334 | 0 |
| 0.7715277777777777 | 0 |
| 0.7722222222222223 | 0 |
| 0.7729166666666667 | 0 |
| 0.7736111111111111 | 0 |
| 0.7743055555555555 | 0 |
| 0.775 | 0 |
| 0.7756944444444445 | 0 |
| 0.7763888888888889 | 0 |
| 0.7770833333333332 | 0 |
| 0.7777777777777778 | 0 |
| 0.7784722222222222 | 0 |
| 0.7791666666666667 | 0 |
| 0.779861111111111 | 0 |
| 0.7805555555555556 | 0 |
| 0.78125 | 0 |
| 0.7819444444444444 | 0 |
| 0.782638888888889 | 0 |
| 0.7833333333333333 | 0 |
| 0.7840277777777778 | 0 |
| 0.7847222222222222 | 0 |
| 0.7854166666666668 | 0 |
| 0.7861111111111111 | 0 |
| 0.7868055555555555 | 0 |
| 0.7875 | 0 |
| 0.7881944444444445 | 0 |
| 0.7888888888888889 | 0 |
| 0.7895833333333333 | 0 |
| 0.7902777777777777 | 0 |
| 0.7909722222222223 | 0 |
| 0.7916666666666666 | 0 |
| 0.7923611111111111 | 0 |
| 0.7930555555555556 | 0 |
| 0.7937500000000001 | 0 |
| 0.7944444444444444 | 0 |
| 0.7951388888888888 | 0 |
| 0.7958333333333334 | 0 |
| 0.7965277777777778 | 0 |
| 0.7972222222222222 | 0 |
| 0.7979166666666666 | 0 |
| 0.7986111111111112 | 0 |
| 0.7993055555555556 | 0 |
| 0.7999999999999999 | 0 |
| 0.8006944444444444 | 0 |
| 0.8013888888888889 | 0 |
| 0.8020833333333334 | 0 |
| 0.8027777777777777 | 0 |
| 0.8034722222222223 | 0 |
| 0.8041666666666667 | 0 |
| 0.8048611111111111 | 0 |
| 0.8055555555555555 | 0 |
| 0.80625 | 0 |
| 0.8069444444444445 | 0 |
| 0.8076388888888889 | 0 |
| 0.8083333333333332 | 0 |
| 0.8090277777777778 | 0 |
| 0.8097222222222222 | 0 |
| 0.8104166666666667 | 0 |
| 0.811111111111111 | 0 |
| 0.8118055555555556 | 0 |
| 0.8125 | 0 |
| 0.8131944444444444 | 0 |
| 0.813888888888889 | 0 |
| 0.8145833333333333 | 0 |
| 0.8152777777777778 | 0 |
| 0.8159722222222222 | 0 |
| 0.8166666666666668 | 0 |
| 0.8173611111111111 | 0 |
| 0.8180555555555555 | 0 |
| 0.81875 | 0 |
| 0.8194444444444445 | 0 |
| 0.8201388888888889 | 0 |
| 0.8208333333333333 | 0 |
| 0.8215277777777777 | 0 |
| 0.8222222222222223 | 0 |
| 0.8229166666666666 | 0 |
| 0.8236111111111111 | 0 |
| 0.8243055555555556 | 0 |
| 0.8250000000000001 | 0 |
| 0.8256944444444444 | 0 |
| 0.8263888888888888 | 0 |
| 0.8270833333333334 | 0 |
| 0.8277777777777778 | 0 |
| 0.8284722222222222 | 0 |
| 0.8291666666666666 | 0 |
| 0.8298611111111112 | 0 |
| 0.8305555555555556 | 0 |
| 0.8312499999999999 | 0 |
| 0.8319444444444444 | 0 |
| 0.8326388888888889 | 0 |
| 0.8333333333333334 | 0 |
| 0.8340277777777777 | 0 |
| 0.8347222222222223 | 0 |
| 0.8354166666666667 | 0 |
| 0.8361111111111111 | 0 |
| 0.8368055555555555 | 0 |
| 0.8375 | 0 |
| 0.8381944444444445 | 0 |
| 0.8388888888888889 | 0 |
| 0.8395833333333332 | 0 |
| 0.8402777777777778 | 0 |
| 0.8409722222222222 | 0 |
| 0.8416666666666667 | 0 |
| 0.842361111111111 | 0 |
| 0.8430555555555556 | 0 |
| 0.84375 | 0 |
| 0.8444444444444444 | 0 |
| 0.845138888888889 | 0 |
| 0.8458333333333333 | 0 |
| 0.8465277777777778 | 0 |
| 0.8472222222222222 | 0 |
| 0.8479166666666668 | 0 |
| 0.8486111111111111 | 0 |
| 0.8493055555555555 | 0 |
| 0.85 | 0 |
| 0.8506944444444445 | 0 |
| 0.8513888888888889 | 0 |
| 0.8520833333333333 | 0 |
| 0.8527777777777777 | 0 |
| 0.8534722222222223 | 0 |
| 0.8541666666666666 | 0 |
| 0.8548611111111111 | 0 |
| 0.8555555555555556 | 0 |
| 0.8562500000000001 | 0 |
| 0.8569444444444444 | 0 |
| 0.8576388888888888 | 0 |
| 0.8583333333333334 | 0 |
| 0.8590277777777778 | 0 |
| 0.8597222222222222 | 0 |
| 0.8604166666666666 | 0 |
| 0.8611111111111112 | 0 |
| 0.8618055555555556 | 0 |
| 0.8624999999999999 | 0 |
| 0.8631944444444444 | 0 |
| 0.8638888888888889 | 0 |
| 0.8645833333333334 | 0 |
| 0.8652777777777777 | 0 |
| 0.8659722222222223 | 0 |
| 0.8666666666666667 | 0 |
| 0.8673611111111111 | 0 |
| 0.8680555555555555 | 0 |
| 0.86875 | 0 |
| 0.8694444444444445 | 0 |
| 0.8701388888888889 | 0 |
| 0.8708333333333332 | 0 |
| 0.8715277777777778 | 0 |
| 0.8722222222222222 | 0 |
| 0.8729166666666667 | 0 |
| 0.873611111111111 | 0 |
| 0.8743055555555556 | 0 |
| 0.875 | 0 |
| 0.8756944444444444 | 0 |
| 0.876388888888889 | 0 |
| 0.8770833333333333 | 0 |
| 0.8777777777777778 | 0 |
| 0.8784722222222222 | 0 |
| 0.8791666666666668 | 0 |
| 0.8798611111111111 | 0 |
| 0.8805555555555555 | 0 |
| 0.88125 | 0 |
| 0.8819444444444445 | 0 |
| 0.8826388888888889 | 0 |
| 0.8833333333333333 | 0 |
| 0.8840277777777777 | 0 |
| 0.8847222222222223 | 0 |
| 0.8854166666666666 | 0 |
| 0.8861111111111111 | 0 |
| 0.8868055555555556 | 0 |
| 0.8875000000000001 | 0 |
| 0.8881944444444444 | 0 |
| 0.8888888888888888 | 0 |
| 0.8895833333333334 | 0 |
| 0.8902777777777778 | 0 |
| 0.8909722222222222 | 0 |
| 0.8916666666666666 | 0 |
| 0.8923611111111112 | 0 |
| 0.8930555555555556 | 0 |
| 0.8937499999999999 | 0 |
| 0.8944444444444444 | 0 |
| 0.8951388888888889 | 0 |
| 0.8958333333333334 | 0 |
| 0.8965277777777777 | 0 |
| 0.8972222222222223 | 0 |
| 0.8979166666666667 | 0 |
| 0.8986111111111111 | 0 |
| 0.8993055555555555 | 0 |
| 0.9 | 0 |
| 0.9006944444444445 | 0 |
| 0.9013888888888889 | 0 |
| 0.9020833333333332 | 0 |
| 0.9027777777777778 | 0 |
| 0.9034722222222222 | 0 |
| 0.9041666666666667 | 0 |
| 0.904861111111111 | 0 |
| 0.9055555555555556 | 0 |
| 0.90625 | 0 |
| 0.9069444444444444 | 0 |
| 0.907638888888889 | 0 |
| 0.9083333333333333 | 0 |
| 0.9090277777777778 | 0 |
| 0.9097222222222222 | 0 |
| 0.9104166666666668 | 0 |
| 0.9111111111111111 | 0 |
| 0.9118055555555555 | 0 |
| 0.9125 | 0 |
| 0.9131944444444445 | 0 |
| 0.9138888888888889 | 0 |
| 0.9145833333333333 | 0 |
| 0.9152777777777777 | 0 |
| 0.9159722222222223 | 0 |
| 0.9166666666666666 | 0 |
| 0.9173611111111111 | 0 |
| 0.9180555555555556 | 0 |
| 0.9187500000000001 | 0 |
| 0.9194444444444444 | 0 |
| 0.9201388888888888 | 0 |
| 0.9208333333333334 | 0 |
| 0.9215277777777778 | 0 |
| 0.9222222222222222 | 0 |
| 0.9229166666666666 | 0 |
| 0.9236111111111112 | 0 |
| 0.9243055555555556 | 0 |
| 0.9249999999999999 | 0 |
| 0.9256944444444444 | 0 |
| 0.9263888888888889 | 0 |
| 0.9270833333333334 | 0 |
| 0.9277777777777777 | 0 |
| 0.9284722222222223 | 0 |
| 0.9291666666666667 | 0 |
| 0.9298611111111111 | 0 |
| 0.9305555555555555 | 0 |
| 0.93125 | 0 |
| 0.9319444444444445 | 0 |
| 0.9326388888888889 | 0 |
| 0.9333333333333332 | 0 |
| 0.9340277777777778 | 0 |
| 0.9347222222222222 | 0 |
| 0.9354166666666667 | 0 |
| 0.936111111111111 | 0 |
| 0.9368055555555556 | 0 |
| 0.9375 | 0 |
| 0.9381944444444444 | 0 |
| 0.938888888888889 | 0 |
| 0.9395833333333333 | 0 |
| 0.9402777777777778 | 0 |
| 0.9409722222222222 | 0 |
| 0.9416666666666668 | 0 |
| 0.9423611111111111 | 0 |
| 0.9430555555555555 | 0 |
| 0.94375 | 0 |
| 0.9444444444444445 | 0 |
| 0.9451388888888889 | 0 |
| 0.9458333333333333 | 0 |
| 0.9465277777777777 | 0 |
| 0.9472222222222223 | 0 |
| 0.9479166666666666 | 0 |
| 0.9486111111111111 | 0 |
| 0.9493055555555556 | 0 |
| 0.9500000000000001 | 0 |
| 0.9506944444444444 | 0 |
| 0.9513888888888888 | 0 |
| 0.9520833333333334 | 0 |
| 0.9527777777777778 | 0 |
| 0.9534722222222222 | 0 |
| 0.9541666666666666 | 0 |
| 0.9548611111111112 | 0 |
| 0.9555555555555556 | 0 |
| 0.9562499999999999 | 0 |
| 0.9569444444444444 | 0 |
| 0.9576388888888889 | 0 |
| 0.9583333333333334 | 0 |
| 0.9590277777777777 | 0 |
| 0.9597222222222223 | 0 |
| 0.9604166666666667 | 0 |
| 0.9611111111111111 | 0 |
| 0.9618055555555555 | 0 |
| 0.9625 | 0 |
| 0.9631944444444445 | 0 |
| 0.9638888888888889 | 0 |
| 0.9645833333333332 | 0 |
| 0.9652777777777778 | 0 |
| 0.9659722222222222 | 0 |
| 0.9666666666666667 | 0 |
| 0.967361111111111 | 0 |
| 0.9680555555555556 | 0 |
| 0.96875 | 0 |
| 0.9694444444444444 | 0 |
| 0.970138888888889 | 0 |
| 0.9708333333333333 | 0 |
| 0.9715277777777778 | 0 |
| 0.9722222222222222 | 0 |
| 0.9729166666666668 | 0 |
| 0.9736111111111111 | 0 |
| 0.9743055555555555 | 0 |
| 0.975 | 0 |
| 0.9756944444444445 | 0 |
| 0.9763888888888889 | 0 |
| 0.9770833333333333 | 0 |
| 0.9777777777777777 | 0 |
| 0.9784722222222223 | 0 |
| 0.9791666666666666 | 0 |
| 0.9798611111111111 | 0 |
| 0.9805555555555556 | 0 |
| 0.9812500000000001 | 0 |
| 0.9819444444444444 | 0 |
| 0.9826388888888888 | 0 |
| 0.9833333333333334 | 0 |
| 0.9840277777777778 | 0 |
| 0.9847222222222222 | 0 |
| 0.9854166666666666 | 0 |
| 0.9861111111111112 | 0 |
| 0.9868055555555556 | 0 |
| 0.9874999999999999 | 0 |
| 0.9881944444444444 | 0 |
| 0.9888888888888889 | 0 |
| 0.9895833333333334 | 0 |
| 0.9902777777777777 | 0 |
| 0.9909722222222223 | 0 |
| 0.9916666666666667 | 0 |
| 0.9923611111111111 | 0 |
| 0.9930555555555555 | 0 |
| 0.99375 | 0 |
| 0.9944444444444445 | 0 |
| 0.9951388888888889 | 0 |
| 0.9958333333333332 | 0 |
| 0.9965277777777778 | 0 |
| 0.9972222222222222 | 0 |
| 0.9979166666666667 | 0 |
| 0.998611111111111 | 0 |
| 0.9993055555555556 | 0 |